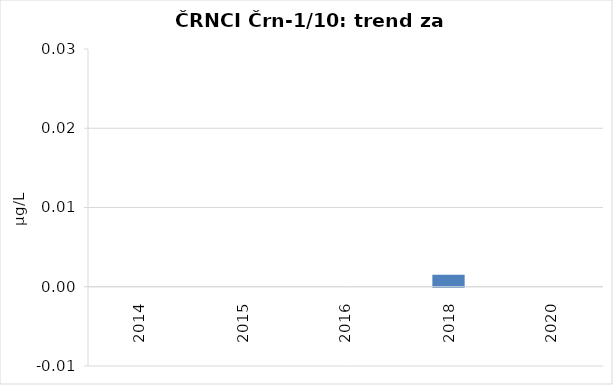
| Category | Vsota |
|---|---|
| 2014 | 0 |
| 2015 | 0 |
| 2016 | 0 |
| 2018 | 0.002 |
| 2020 | 0 |